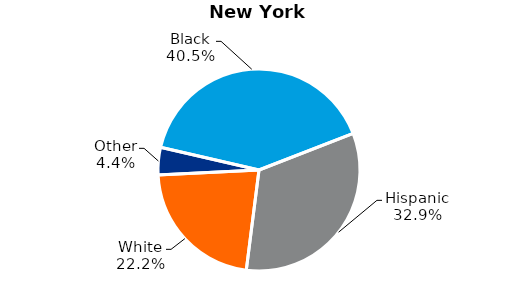
| Category | Series 0 | New York City |
|---|---|---|
| Black | 40.5 |  |
| Hispanic | 32.9 |  |
| White | 22.2 |  |
| Other | 4.4 |  |